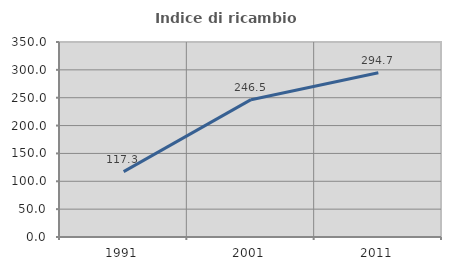
| Category | Indice di ricambio occupazionale  |
|---|---|
| 1991.0 | 117.284 |
| 2001.0 | 246.512 |
| 2011.0 | 294.667 |